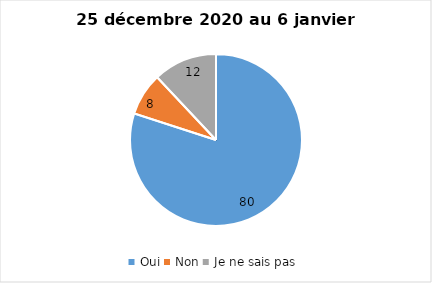
| Category | Series 0 |
|---|---|
| Oui | 80 |
| Non | 8 |
| Je ne sais pas | 12 |